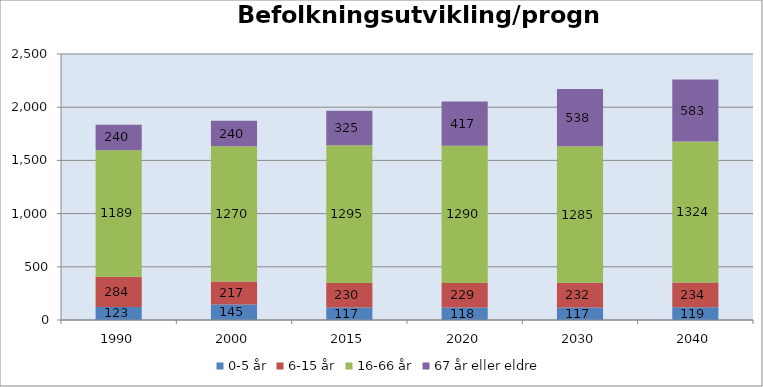
| Category | 0-5 år | 6-15 år | 16-66 år | 67 år eller eldre |
|---|---|---|---|---|
| 1990 | 123 | 284 | 1189 | 240 |
| 2000 | 145 | 217 | 1270 | 240 |
| 2015 | 117 | 230 | 1295 | 325 |
| 2020 | 118 | 229 | 1290 | 417 |
| 2030 | 117 | 232 | 1285 | 538 |
| 2040 | 119 | 234 | 1324 | 583 |